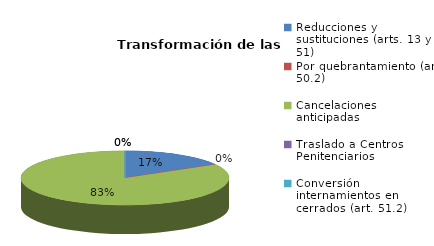
| Category | Series 0 |
|---|---|
| Reducciones y sustituciones (arts. 13 y 51) | 1 |
| Por quebrantamiento (art. 50.2) | 0 |
| Cancelaciones anticipadas | 5 |
| Traslado a Centros Penitenciarios | 0 |
| Conversión internamientos en cerrados (art. 51.2) | 0 |